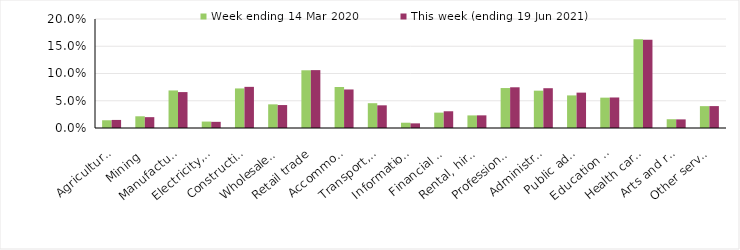
| Category | Week ending 14 Mar 2020 | This week (ending 19 Jun 2021) |
|---|---|---|
| Agriculture, forestry and fishing | 0.014 | 0.015 |
| Mining | 0.022 | 0.02 |
| Manufacturing | 0.069 | 0.066 |
| Electricity, gas, water and waste services | 0.012 | 0.011 |
| Construction | 0.073 | 0.076 |
| Wholesale trade | 0.043 | 0.042 |
| Retail trade | 0.106 | 0.106 |
| Accommodation and food services | 0.075 | 0.071 |
| Transport, postal and warehousing | 0.046 | 0.042 |
| Information media and telecommunications | 0.01 | 0.008 |
| Financial and insurance services | 0.028 | 0.031 |
| Rental, hiring and real estate services | 0.023 | 0.023 |
| Professional, scientific and technical services | 0.073 | 0.075 |
| Administrative and support services | 0.068 | 0.073 |
| Public administration and safety | 0.06 | 0.065 |
| Education and training | 0.056 | 0.056 |
| Health care and social assistance | 0.163 | 0.162 |
| Arts and recreation services | 0.016 | 0.016 |
| Other services | 0.04 | 0.04 |